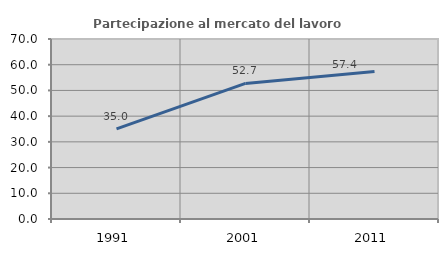
| Category | Partecipazione al mercato del lavoro  femminile |
|---|---|
| 1991.0 | 35.023 |
| 2001.0 | 52.736 |
| 2011.0 | 57.404 |